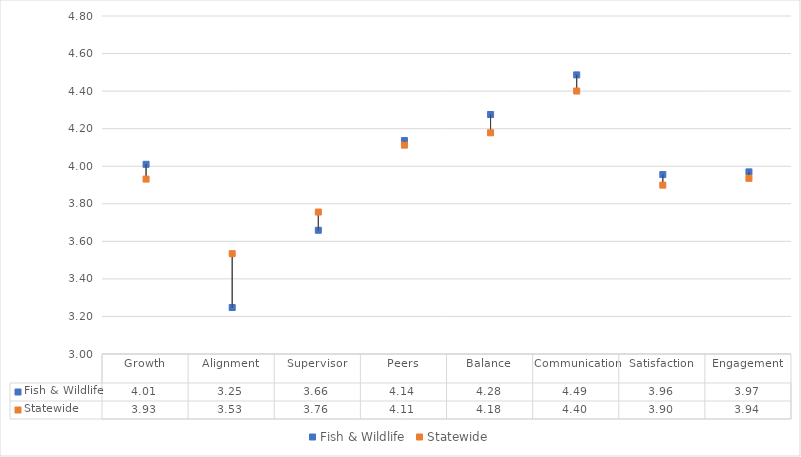
| Category | Fish & Wildlife | Statewide |
|---|---|---|
| Growth | 4.01 | 3.931 |
| Alignment | 3.247 | 3.534 |
| Supervisor | 3.659 | 3.756 |
| Peers | 4.137 | 4.112 |
| Balance | 4.276 | 4.178 |
| Communication | 4.486 | 4.4 |
| Satisfaction | 3.956 | 3.899 |
| Engagement | 3.97 | 3.936 |